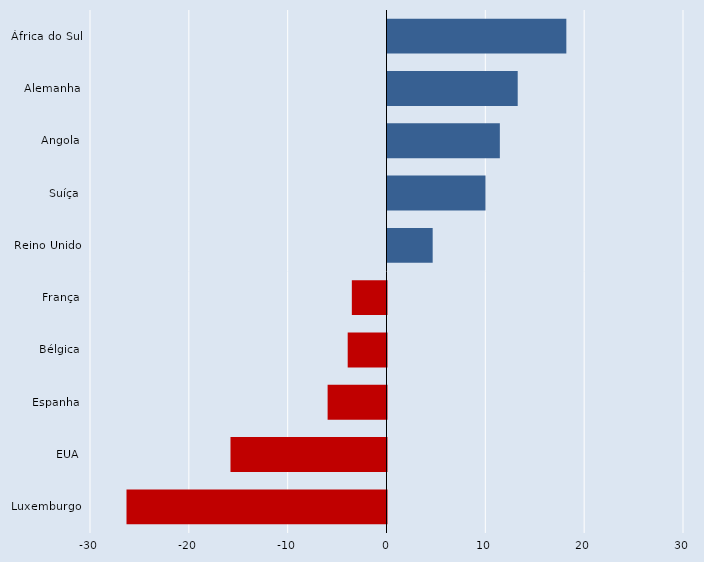
| Category | Series 0 |
|---|---|
| África do Sul | 18.095 |
| Alemanha | 13.174 |
| Angola | 11.367 |
| Suíça | 9.917 |
| Reino Unido | 4.571 |
| França | -3.507 |
| Bélgica | -3.926 |
| Espanha | -5.958 |
| EUA | -15.785 |
| Luxemburgo | -26.307 |